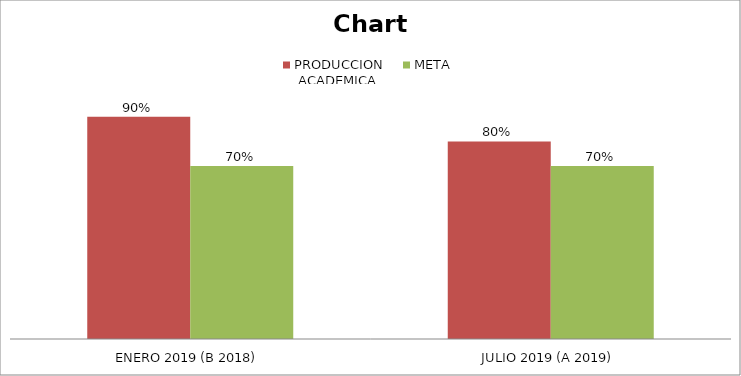
| Category | PRODUCCION
 ACADEMICA | META |
|---|---|---|
| ENERO 2019 (B 2018) | 0.9 | 0.7 |
| JULIO 2019 (A 2019) | 0.8 | 0.7 |